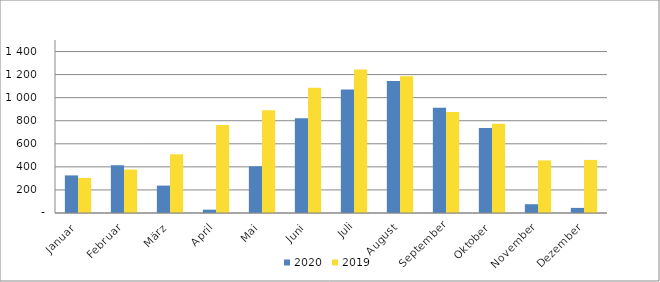
| Category | 2020 | 2019 |
|---|---|---|
| Januar | 325980 | 304091 |
| Februar | 414127 | 376664 |
| März | 237668 | 508668 |
| April | 28867 | 762762 |
| Mai | 404870 | 891354 |
| Juni | 820867 | 1086638 |
| Juli | 1070071 | 1244103 |
| August | 1144363 | 1184768 |
| September | 913446 | 875331 |
| Oktober | 736892 | 773129 |
| November | 76148 | 456199 |
| Dezember | 44298 | 460123 |